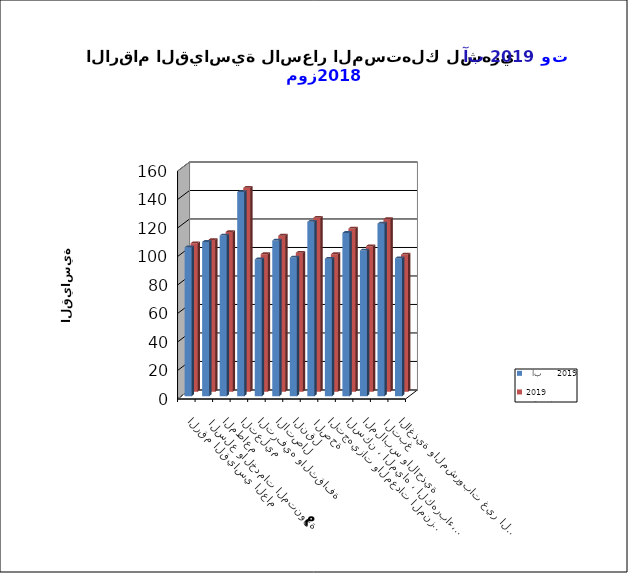
| Category |   آب     2019      |   تموز     2019      |
|---|---|---|
| الاغذية والمشروبات غير الكحولية | 96.8 | 96.2 |
|  التبغ | 121.1 | 121.1 |
| الملابس والاحذية | 102.3 | 102.1 |
| السكن ، المياه ، الكهرباء، الغاز  | 114.6 | 114.5 |
| التجهيزات والمعدات المنزلية والصيانة | 96.5 | 96.5 |
|  الصحة | 122.4 | 122.1 |
| النقل | 97.3 | 97.5 |
| الاتصال | 109.3 | 109.5 |
| الترفيه والثقافة | 96 | 96.5 |
| التعليم | 143.3 | 143.1 |
| المطاعم  | 112.8 | 112.1 |
|  السلع والخدمات المتنوعة | 108.3 | 106.4 |
| الرقم القياسي العام | 104.5 | 104.2 |